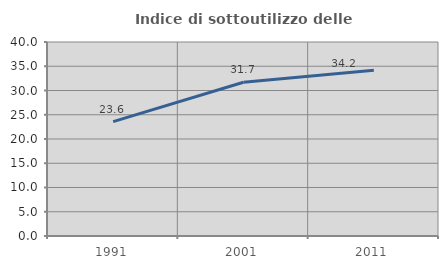
| Category | Indice di sottoutilizzo delle abitazioni  |
|---|---|
| 1991.0 | 23.595 |
| 2001.0 | 31.708 |
| 2011.0 | 34.185 |